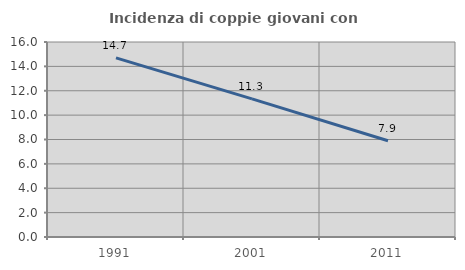
| Category | Incidenza di coppie giovani con figli |
|---|---|
| 1991.0 | 14.697 |
| 2001.0 | 11.331 |
| 2011.0 | 7.902 |